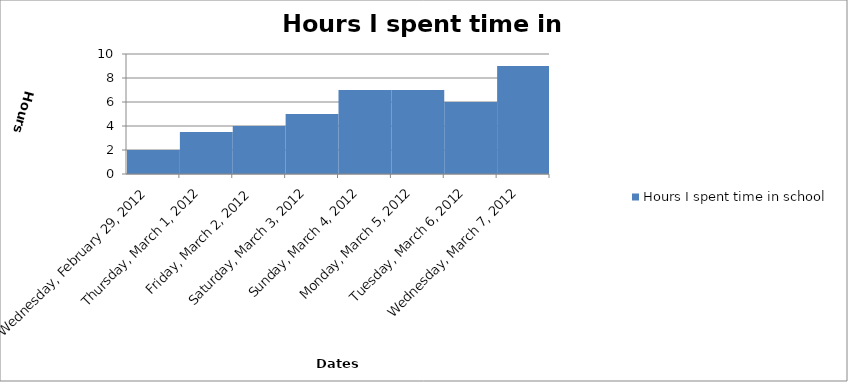
| Category | Hours I spent time in school |
|---|---|
| 2012-02-29 | 2 |
| 2012-03-01 | 3.5 |
| 2012-03-02 | 4 |
| 2012-03-03 | 5 |
| 2012-03-04 | 7 |
| 2012-03-05 | 7 |
| 2012-03-06 | 6 |
| 2012-03-07 | 9 |